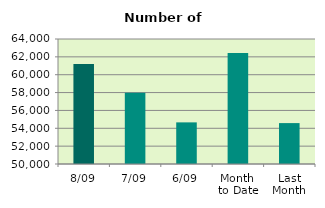
| Category | Series 0 |
|---|---|
| 8/09 | 61202 |
| 7/09 | 57976 |
| 6/09 | 54662 |
| Month 
to Date | 62423.667 |
| Last
Month | 54581.565 |